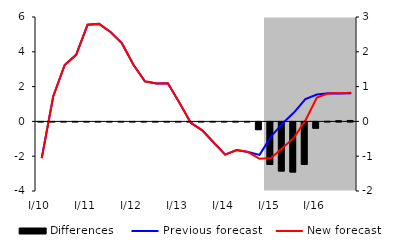
| Category | Differences |
|---|---|
| 0 | 0 |
| 1 | 0 |
| 2 | 0 |
| 3 | 0 |
| 4 | 0 |
| 5 | 0 |
| 6 | 0 |
| 7 | 0 |
| 8 | 0 |
| 9 | 0 |
| 10 | 0 |
| 11 | 0 |
| 12 | 0 |
| 13 | 0 |
| 14 | 0 |
| 15 | 0 |
| 16 | 0 |
| 17 | 0.002 |
| 18 | 0 |
| 19 | -0.222 |
| 20 | -1.222 |
| 21 | -1.411 |
| 22 | -1.439 |
| 23 | -1.22 |
| 24 | -0.18 |
| 25 | 0.004 |
| 26 | 0.019 |
| 27 | 0.027 |